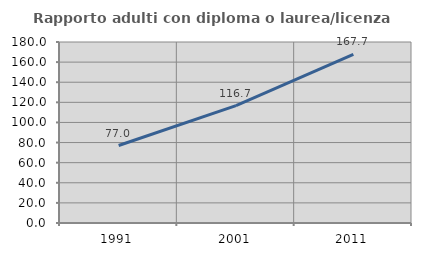
| Category | Rapporto adulti con diploma o laurea/licenza media  |
|---|---|
| 1991.0 | 77.039 |
| 2001.0 | 116.672 |
| 2011.0 | 167.667 |